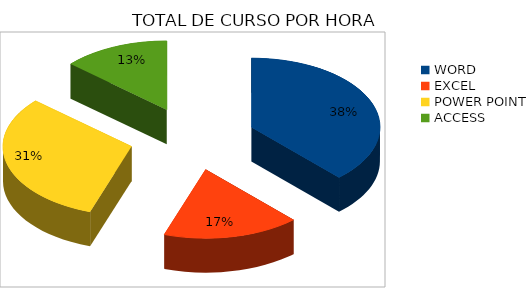
| Category | Series 0 |
|---|---|
| WORD | 51 |
| EXCEL | 23 |
| POWER POINT | 42 |
| ACCESS | 18 |